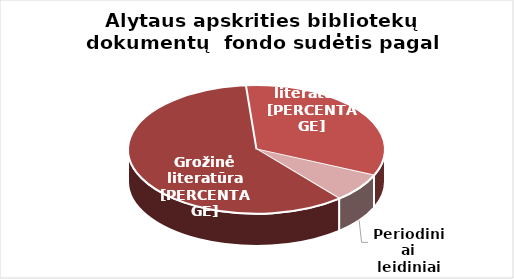
| Category | Series 0 |
|---|---|
| Grožinė literatūra* | 668082 |
| Šakinė literatūra* | 368374 |
| Periodiniai leidiniai | 80796 |